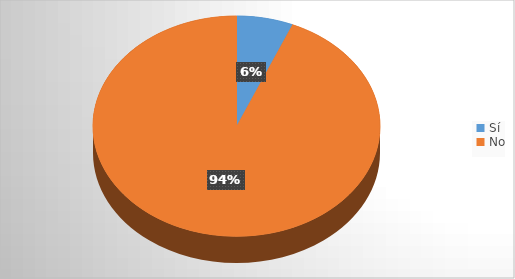
| Category | Series 0 |
|---|---|
| Sí | 15 |
| No | 221 |